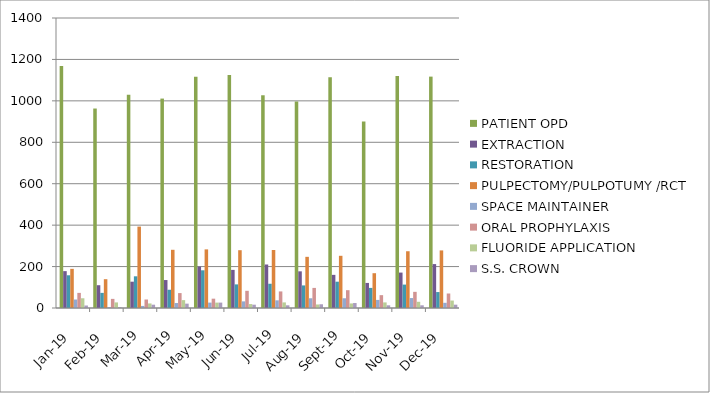
| Category | PATIENT OPD | EXTRACTION | RESTORATION | PULPECTOMY/PULPOTUMY /RCT | SPACE MAINTAINER | ORAL PROPHYLAXIS | FLUORIDE APPLICATION | S.S. CROWN   |
|---|---|---|---|---|---|---|---|---|
| 2019-01-01 | 1168 | 178 | 158 | 189 | 41 | 73 | 47 | 12 |
| 2019-02-01 | 963 | 110 | 73 | 139 | 4 | 44 | 27 | 4 |
| 2019-03-01 | 1029 | 127 | 153 | 393 | 10 | 41 | 22 | 16 |
| 2019-04-01 | 1011 | 135 | 88 | 281 | 24 | 72 | 38 | 21 |
| 2019-05-01 | 1116 | 200 | 182 | 283 | 26 | 45 | 26 | 26 |
| 2019-06-01 | 1125 | 184 | 114 | 279 | 32 | 83 | 19 | 16 |
| 2019-07-01 | 1027 | 210 | 117 | 280 | 37 | 80 | 27 | 13 |
| 2019-08-01 | 997 | 177 | 109 | 247 | 47 | 97 | 17 | 18 |
| 2019-09-01 | 1114 | 160 | 127 | 252 | 47 | 86 | 22 | 24 |
| 2019-10-01 | 900 | 121 | 97 | 168 | 39 | 62 | 27 | 13 |
| 2019-11-01 | 1120 | 171 | 113 | 274 | 48 | 78 | 30 | 13 |
| 2019-12-01 | 1117 | 212 | 77 | 278 | 25 | 70 | 36 | 16 |